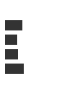
| Category | Series 0 |
|---|---|
| 0 | 0.23 |
| 1 | 0.156 |
| 2 | 0.169 |
| 3 | 0.252 |